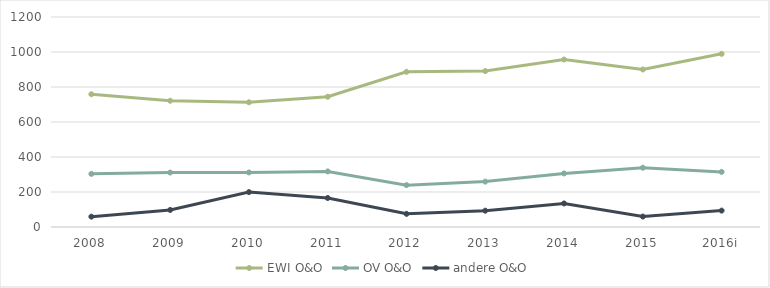
| Category | EWI | OV | andere |
|---|---|---|---|
| 2008 |  |  |  |
| 2009 |  |  |  |
| 2010 |  |  |  |
| 2011 |  |  |  |
| 2012 |  |  |  |
| 2013 |  |  |  |
| 2014 |  |  |  |
| 2015 |  |  |  |
| 2016i |  |  |  |